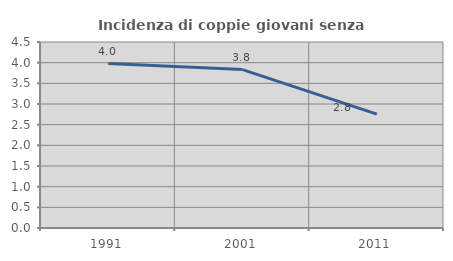
| Category | Incidenza di coppie giovani senza figli |
|---|---|
| 1991.0 | 3.978 |
| 2001.0 | 3.833 |
| 2011.0 | 2.755 |